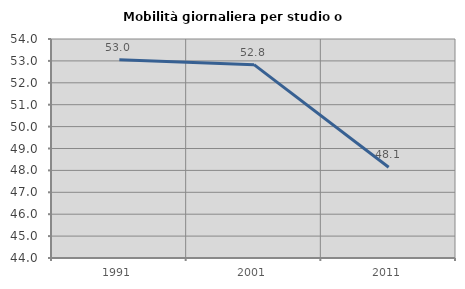
| Category | Mobilità giornaliera per studio o lavoro |
|---|---|
| 1991.0 | 53.047 |
| 2001.0 | 52.828 |
| 2011.0 | 48.144 |